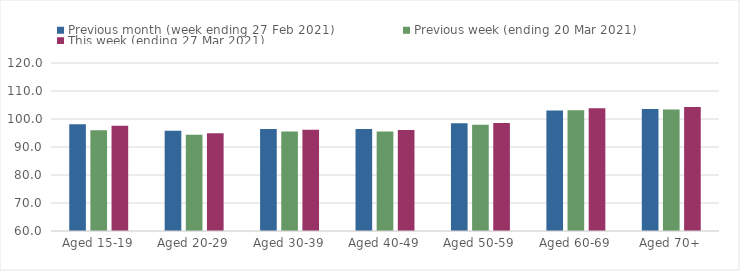
| Category | Previous month (week ending 27 Feb 2021) | Previous week (ending 20 Mar 2021) | This week (ending 27 Mar 2021) |
|---|---|---|---|
| Aged 15-19 | 98.14 | 95.96 | 97.62 |
| Aged 20-29 | 95.82 | 94.39 | 94.91 |
| Aged 30-39 | 96.46 | 95.54 | 96.15 |
| Aged 40-49 | 96.41 | 95.53 | 96.09 |
| Aged 50-59 | 98.46 | 97.94 | 98.58 |
| Aged 60-69 | 103.08 | 103.16 | 103.85 |
| Aged 70+ | 103.53 | 103.35 | 104.31 |